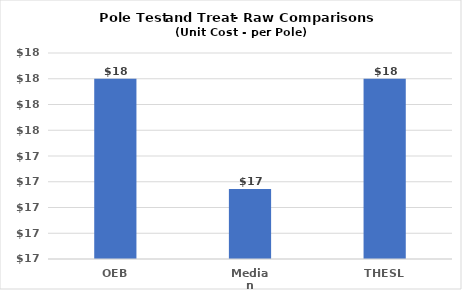
| Category | Series 0 |
|---|---|
| OEB | 18 |
| Median | 17.143 |
| THESL | 18 |